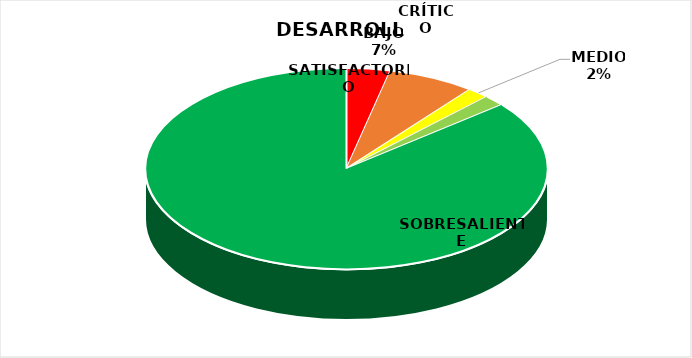
| Category | Series 2 | Series 1 | Series 0 |
|---|---|---|---|
| CRÍTICO | 2 | 0 | 2 |
| BAJO | 4 | 2 | 4 |
| MEDIO | 1 | 3 | 1 |
| SATISFACTORIO | 1 | 7 | 1 |
| SOBRESALIENTE | 49 | 11 | 49 |